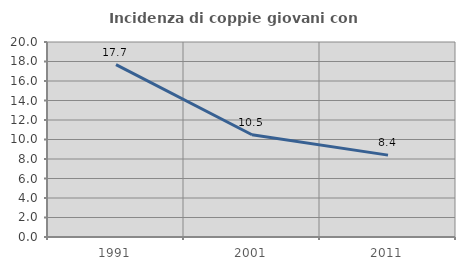
| Category | Incidenza di coppie giovani con figli |
|---|---|
| 1991.0 | 17.688 |
| 2001.0 | 10.487 |
| 2011.0 | 8.397 |